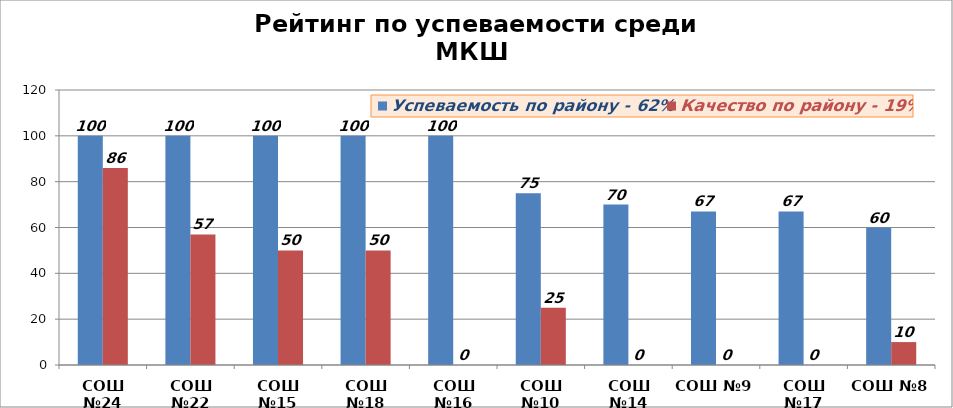
| Category | Успеваемость по району - 62% | Качество по району - 19% |
|---|---|---|
| СОШ №24 | 100 | 86 |
| СОШ №22 | 100 | 57 |
| СОШ №15 | 100 | 50 |
| СОШ №18 | 100 | 50 |
| СОШ №16 | 100 | 0 |
| СОШ №10 | 75 | 25 |
| СОШ №14 | 70 | 0 |
| СОШ №9 | 67 | 0 |
| СОШ №17 | 67 | 0 |
| СОШ №8 | 60 | 10 |